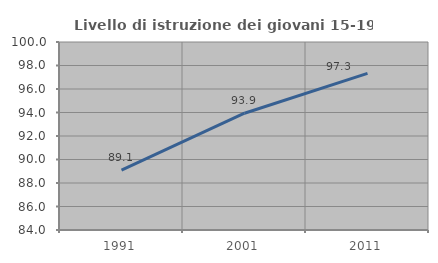
| Category | Livello di istruzione dei giovani 15-19 anni |
|---|---|
| 1991.0 | 89.091 |
| 2001.0 | 93.939 |
| 2011.0 | 97.333 |